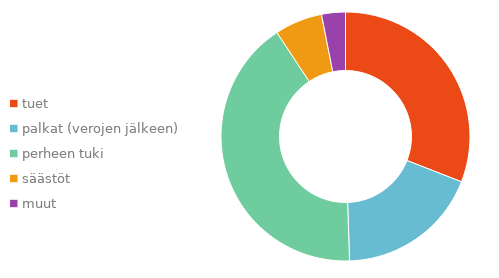
| Category | Series 0 |
|---|---|
| tuet | 0.309 |
| palkat (verojen jälkeen) | 0.186 |
| perheen tuki | 0.412 |
| säästöt | 0.062 |
| muut | 0.031 |